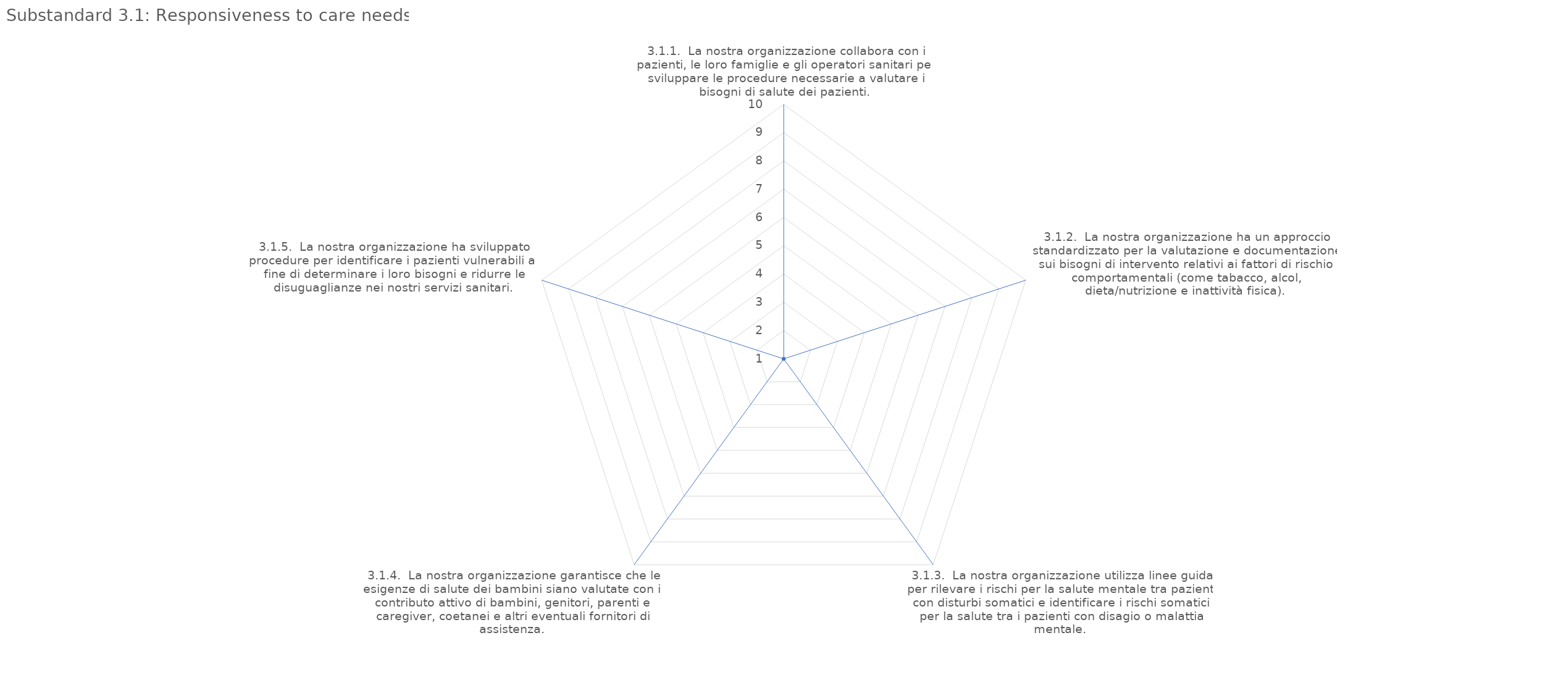
| Category | value |
|---|---|
| 3.1.1.  La nostra organizzazione collabora con i pazienti, le loro famiglie e gli operatori sanitari per sviluppare le procedure necessarie a valutare i bisogni di salute dei pazienti. | 1 |
| 3.1.2.  La nostra organizzazione ha un approccio standardizzato per la valutazione e documentazione sui bisogni di intervento relativi ai fattori di rischio comportamentali (come tabacco, alcol, dieta/nutrizione e inattività fisica). | 1 |
| 3.1.3.  La nostra organizzazione utilizza linee guida per rilevare i rischi per la salute mentale tra pazienti con disturbi somatici e identificare i rischi somatici per la salute tra i pazienti con disagio o malattia mentale. | 1 |
| 3.1.4.  La nostra organizzazione garantisce che le esigenze di salute dei bambini siano valutate con il contributo attivo di bambini, genitori, parenti e caregiver, coetanei e altri eventuali fornitori di assistenza. | 1 |
| 3.1.5.  La nostra organizzazione ha sviluppato procedure per identificare i pazienti vulnerabili al fine di determinare i loro bisogni e ridurre le disuguaglianze nei nostri servizi sanitari. | 1 |